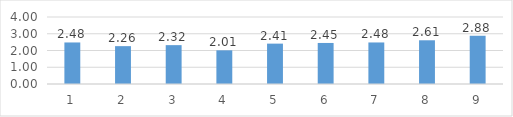
| Category | Series 0 |
|---|---|
| 0 | 2.48 |
| 1 | 2.26 |
| 2 | 2.32 |
| 3 | 2.01 |
| 4 | 2.41 |
| 5 | 2.45 |
| 6 | 2.48 |
| 7 | 2.61 |
| 8 | 2.88 |